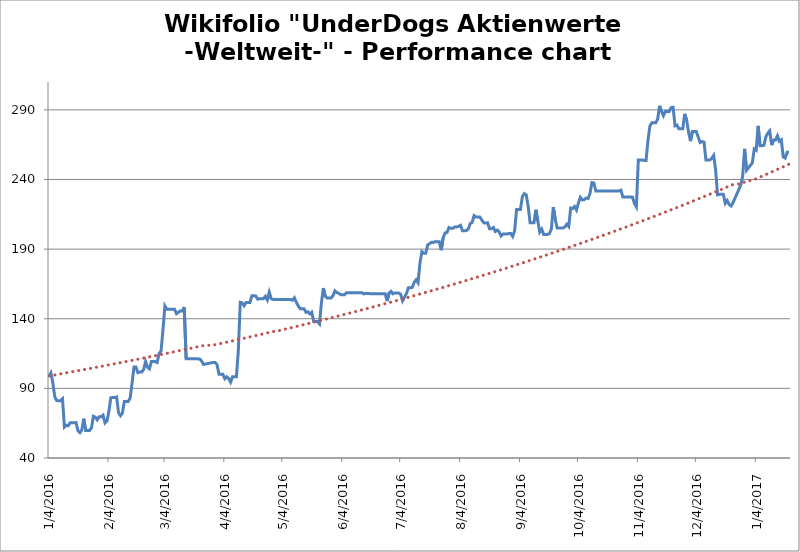
| Category | Close | Trend |
|---|---|---|
| 04/01/2016 | 98.898 | 98.898 |
| 05/01/2016 | 101.12 | 99.145 |
| 06/01/2016 | 93.999 | 99.393 |
| 07/01/2016 | 84.12 | 99.642 |
| 08/01/2016 | 81.237 | 99.891 |
| 09/01/2016 | 81.153 | 100.14 |
| 10/01/2016 | 81.151 | 100.391 |
| 11/01/2016 | 82.548 | 100.642 |
| 12/01/2016 | 62.218 | 100.893 |
| 13/01/2016 | 63.451 | 101.146 |
| 14/01/2016 | 63.203 | 101.398 |
| 15/01/2016 | 65.341 | 101.652 |
| 16/01/2016 | 65.339 | 101.906 |
| 17/01/2016 | 65.338 | 102.161 |
| 18/01/2016 | 65.418 | 102.416 |
| 19/01/2016 | 59.573 | 102.672 |
| 20/01/2016 | 58.172 | 102.929 |
| 21/01/2016 | 60.228 | 103.186 |
| 22/01/2016 | 68.21 | 103.444 |
| 23/01/2016 | 59.731 | 103.703 |
| 24/01/2016 | 59.73 | 103.962 |
| 25/01/2016 | 59.728 | 104.222 |
| 26/01/2016 | 61.701 | 104.483 |
| 27/01/2016 | 69.938 | 104.744 |
| 28/01/2016 | 69.278 | 105.006 |
| 29/01/2016 | 67.376 | 105.268 |
| 30/01/2016 | 69.596 | 105.531 |
| 31/01/2016 | 69.594 | 105.795 |
| 01/02/2016 | 70.744 | 106.06 |
| 02/02/2016 | 65.146 | 106.325 |
| 03/02/2016 | 66.544 | 106.591 |
| 04/02/2016 | 73.381 | 106.857 |
| 05/02/2016 | 83.247 | 107.124 |
| 06/02/2016 | 83.409 | 107.392 |
| 07/02/2016 | 83.407 | 107.661 |
| 08/02/2016 | 83.825 | 107.93 |
| 09/02/2016 | 72.539 | 108.199 |
| 10/02/2016 | 70.397 | 108.47 |
| 11/02/2016 | 72.206 | 108.741 |
| 12/02/2016 | 80.599 | 109.013 |
| 13/02/2016 | 80.597 | 109.286 |
| 14/02/2016 | 80.595 | 109.559 |
| 15/02/2016 | 83.064 | 109.833 |
| 16/02/2016 | 93.758 | 110.107 |
| 17/02/2016 | 105.361 | 110.383 |
| 18/02/2016 | 105.383 | 110.658 |
| 19/02/2016 | 101.257 | 110.935 |
| 20/02/2016 | 101.757 | 111.212 |
| 21/02/2016 | 101.754 | 111.49 |
| 22/02/2016 | 103.505 | 111.769 |
| 23/02/2016 | 109.18 | 112.049 |
| 24/02/2016 | 105.228 | 112.329 |
| 25/02/2016 | 104.032 | 112.61 |
| 26/02/2016 | 109.254 | 112.891 |
| 27/02/2016 | 109.252 | 113.173 |
| 28/02/2016 | 109.249 | 113.456 |
| 29/02/2016 | 108.58 | 113.74 |
| 01/03/2016 | 115.086 | 114.024 |
| 02/03/2016 | 116.729 | 114.309 |
| 03/03/2016 | 132.184 | 114.595 |
| 04/03/2016 | 149.232 | 114.882 |
| 05/03/2016 | 146.82 | 115.169 |
| 06/03/2016 | 146.816 | 115.457 |
| 07/03/2016 | 146.813 | 115.745 |
| 08/03/2016 | 146.809 | 116.035 |
| 09/03/2016 | 146.805 | 116.325 |
| 10/03/2016 | 143.618 | 116.616 |
| 11/03/2016 | 144.649 | 116.907 |
| 12/03/2016 | 145.615 | 117.199 |
| 13/03/2016 | 145.569 | 117.492 |
| 14/03/2016 | 148.306 | 117.786 |
| 15/03/2016 | 111.196 | 118.081 |
| 16/03/2016 | 111.193 | 118.376 |
| 17/03/2016 | 111.191 | 118.672 |
| 18/03/2016 | 111.188 | 118.968 |
| 19/03/2016 | 111.185 | 119.266 |
| 20/03/2016 | 111.182 | 119.564 |
| 21/03/2016 | 111.179 | 119.863 |
| 22/03/2016 | 111.176 | 120.163 |
| 23/03/2016 | 109.614 | 120.463 |
| 24/03/2016 | 107.199 | 120.764 |
| 29/03/2016 | 108.614 | 121.066 |
| 30/03/2016 | 108.611 | 121.369 |
| 31/03/2016 | 106.915 | 121.672 |
| 01/04/2016 | 100.081 | 121.976 |
| 02/04/2016 | 100.079 | 122.281 |
| 03/04/2016 | 100.076 | 122.587 |
| 04/04/2016 | 96.97 | 122.893 |
| 05/04/2016 | 98.289 | 123.201 |
| 06/04/2016 | 97.098 | 123.509 |
| 07/04/2016 | 94.423 | 123.817 |
| 08/04/2016 | 98.282 | 124.127 |
| 09/04/2016 | 98.279 | 124.437 |
| 10/04/2016 | 98.276 | 124.748 |
| 11/04/2016 | 117.133 | 125.06 |
| 12/04/2016 | 151.79 | 125.373 |
| 13/04/2016 | 151.403 | 125.686 |
| 14/04/2016 | 149.32 | 126.001 |
| 15/04/2016 | 151.733 | 126.316 |
| 16/04/2016 | 151.735 | 126.631 |
| 17/04/2016 | 151.596 | 126.948 |
| 18/04/2016 | 156.443 | 127.265 |
| 19/04/2016 | 156.6 | 127.583 |
| 20/04/2016 | 156.338 | 127.902 |
| 21/04/2016 | 154.053 | 128.222 |
| 22/04/2016 | 154.409 | 128.543 |
| 23/04/2016 | 154.405 | 128.864 |
| 24/04/2016 | 154.401 | 129.186 |
| 25/04/2016 | 156.077 | 129.509 |
| 26/04/2016 | 153.493 | 129.833 |
| 27/04/2016 | 159.069 | 130.158 |
| 28/04/2016 | 154.379 | 130.483 |
| 29/04/2016 | 153.895 | 130.809 |
| 30/04/2016 | 153.891 | 131.136 |
| 02/05/2016 | 153.883 | 131.464 |
| 03/05/2016 | 153.879 | 131.793 |
| 04/05/2016 | 153.875 | 132.122 |
| 05/05/2016 | 153.871 | 132.452 |
| 06/05/2016 | 153.867 | 132.784 |
| 07/05/2016 | 153.863 | 133.116 |
| 08/05/2016 | 153.859 | 133.448 |
| 09/05/2016 | 153.243 | 133.782 |
| 10/05/2016 | 155.031 | 134.116 |
| 11/05/2016 | 151.84 | 134.452 |
| 12/05/2016 | 149.236 | 134.788 |
| 13/05/2016 | 147.232 | 135.125 |
| 14/05/2016 | 147.229 | 135.463 |
| 15/05/2016 | 147.225 | 135.801 |
| 16/05/2016 | 144.621 | 136.141 |
| 17/05/2016 | 145.017 | 136.481 |
| 18/05/2016 | 143.494 | 136.822 |
| 19/05/2016 | 144.69 | 137.164 |
| 20/05/2016 | 137.955 | 137.507 |
| 21/05/2016 | 137.952 | 137.851 |
| 22/05/2016 | 137.948 | 138.196 |
| 23/05/2016 | 136.284 | 138.541 |
| 24/05/2016 | 151.428 | 138.888 |
| 25/05/2016 | 162.007 | 139.235 |
| 26/05/2016 | 156.102 | 139.583 |
| 27/05/2016 | 154.874 | 139.932 |
| 28/05/2016 | 154.87 | 140.282 |
| 29/05/2016 | 154.866 | 140.632 |
| 30/05/2016 | 156.625 | 140.984 |
| 31/05/2016 | 160.024 | 141.336 |
| 01/06/2016 | 158.773 | 141.69 |
| 02/06/2016 | 158.244 | 142.044 |
| 03/06/2016 | 157.24 | 142.399 |
| 04/06/2016 | 157.236 | 142.755 |
| 05/06/2016 | 157.231 | 143.112 |
| 06/06/2016 | 158.692 | 143.47 |
| 07/06/2016 | 158.688 | 143.828 |
| 08/06/2016 | 158.684 | 144.188 |
| 09/06/2016 | 158.68 | 144.548 |
| 10/06/2016 | 158.676 | 144.91 |
| 11/06/2016 | 158.672 | 145.272 |
| 12/06/2016 | 158.668 | 145.635 |
| 13/06/2016 | 158.663 | 145.999 |
| 14/06/2016 | 158.659 | 146.364 |
| 15/06/2016 | 157.811 | 146.73 |
| 16/06/2016 | 158.338 | 147.097 |
| 17/06/2016 | 158.038 | 147.465 |
| 18/06/2016 | 158.034 | 147.834 |
| 19/06/2016 | 158.03 | 148.203 |
| 20/06/2016 | 158.026 | 148.574 |
| 21/06/2016 | 158.021 | 148.945 |
| 22/06/2016 | 158.017 | 149.317 |
| 23/06/2016 | 158.013 | 149.691 |
| 24/06/2016 | 158.009 | 150.065 |
| 25/06/2016 | 158.005 | 150.44 |
| 26/06/2016 | 158.001 | 150.816 |
| 27/06/2016 | 152.716 | 151.193 |
| 28/06/2016 | 158.431 | 151.571 |
| 29/06/2016 | 159.679 | 151.95 |
| 30/06/2016 | 157.919 | 152.33 |
| 01/07/2016 | 158.493 | 152.711 |
| 02/07/2016 | 158.536 | 153.093 |
| 03/07/2016 | 158.531 | 153.475 |
| 04/07/2016 | 157.556 | 153.859 |
| 05/07/2016 | 152.828 | 154.244 |
| 06/07/2016 | 155.516 | 154.629 |
| 07/07/2016 | 158.098 | 155.016 |
| 08/07/2016 | 162.233 | 155.403 |
| 09/07/2016 | 162.243 | 155.792 |
| 10/07/2016 | 162.503 | 156.181 |
| 11/07/2016 | 166.131 | 156.572 |
| 12/07/2016 | 167.989 | 156.963 |
| 13/07/2016 | 165.906 | 157.356 |
| 14/07/2016 | 179.957 | 157.749 |
| 15/07/2016 | 188.229 | 158.143 |
| 16/07/2016 | 186.985 | 158.539 |
| 17/07/2016 | 186.977 | 158.935 |
| 18/07/2016 | 192.982 | 159.332 |
| 19/07/2016 | 193.945 | 159.731 |
| 20/07/2016 | 194.959 | 160.13 |
| 21/07/2016 | 194.791 | 160.53 |
| 22/07/2016 | 195.377 | 160.932 |
| 23/07/2016 | 195.356 | 161.334 |
| 24/07/2016 | 195.351 | 161.737 |
| 25/07/2016 | 189.195 | 162.142 |
| 26/07/2016 | 198.283 | 162.547 |
| 27/07/2016 | 201.543 | 162.954 |
| 28/07/2016 | 201.99 | 163.361 |
| 29/07/2016 | 205.496 | 163.769 |
| 30/07/2016 | 204.953 | 164.179 |
| 31/07/2016 | 204.947 | 164.589 |
| 01/08/2016 | 205.903 | 165.001 |
| 02/08/2016 | 205.945 | 165.413 |
| 03/08/2016 | 206.257 | 165.827 |
| 04/08/2016 | 207.079 | 166.241 |
| 05/08/2016 | 203.123 | 166.657 |
| 06/08/2016 | 203.155 | 167.074 |
| 07/08/2016 | 203.35 | 167.491 |
| 08/08/2016 | 204.365 | 167.91 |
| 09/08/2016 | 208.353 | 168.33 |
| 10/08/2016 | 209.128 | 168.751 |
| 11/08/2016 | 214.047 | 169.172 |
| 12/08/2016 | 213.003 | 169.595 |
| 13/08/2016 | 213.003 | 170.019 |
| 14/08/2016 | 212.998 | 170.444 |
| 15/08/2016 | 210.897 | 170.87 |
| 16/08/2016 | 208.899 | 171.298 |
| 17/08/2016 | 208.731 | 171.726 |
| 18/08/2016 | 208.915 | 172.155 |
| 19/08/2016 | 204.636 | 172.586 |
| 20/08/2016 | 204.636 | 173.017 |
| 21/08/2016 | 205.552 | 173.45 |
| 22/08/2016 | 202.671 | 173.883 |
| 23/08/2016 | 203.651 | 174.318 |
| 24/08/2016 | 202.365 | 174.754 |
| 25/08/2016 | 199.56 | 175.191 |
| 26/08/2016 | 200.912 | 175.629 |
| 27/08/2016 | 200.907 | 176.068 |
| 28/08/2016 | 200.851 | 176.508 |
| 29/08/2016 | 201.238 | 176.949 |
| 30/08/2016 | 201.232 | 177.391 |
| 31/08/2016 | 199.05 | 177.835 |
| 01/09/2016 | 203.323 | 178.28 |
| 02/09/2016 | 218.455 | 178.725 |
| 03/09/2016 | 218.455 | 179.172 |
| 04/09/2016 | 218.449 | 179.62 |
| 05/09/2016 | 227.714 | 180.069 |
| 06/09/2016 | 229.847 | 180.519 |
| 07/09/2016 | 228.924 | 180.97 |
| 08/09/2016 | 220.651 | 181.423 |
| 09/09/2016 | 208.925 | 181.876 |
| 10/09/2016 | 208.92 | 182.331 |
| 11/09/2016 | 208.915 | 182.787 |
| 12/09/2016 | 218.264 | 183.244 |
| 13/09/2016 | 210.044 | 183.702 |
| 14/09/2016 | 202.247 | 184.161 |
| 15/09/2016 | 204.384 | 184.622 |
| 16/09/2016 | 200.508 | 185.083 |
| 17/09/2016 | 200.502 | 185.546 |
| 18/09/2016 | 200.497 | 186.01 |
| 19/09/2016 | 201.124 | 186.475 |
| 20/09/2016 | 204.516 | 186.941 |
| 21/09/2016 | 220.085 | 187.408 |
| 22/09/2016 | 211.537 | 187.877 |
| 23/09/2016 | 205.106 | 188.347 |
| 24/09/2016 | 205.106 | 188.818 |
| 25/09/2016 | 205.101 | 189.29 |
| 26/09/2016 | 205.09 | 189.763 |
| 27/09/2016 | 205.904 | 190.237 |
| 28/09/2016 | 207.927 | 190.713 |
| 29/09/2016 | 206.258 | 191.19 |
| 30/09/2016 | 219.508 | 191.668 |
| 01/10/2016 | 219.133 | 192.147 |
| 02/10/2016 | 220.627 | 192.627 |
| 03/10/2016 | 218.084 | 193.109 |
| 04/10/2016 | 223.034 | 193.591 |
| 05/10/2016 | 227.166 | 194.075 |
| 06/10/2016 | 225.398 | 194.561 |
| 07/10/2016 | 225.517 | 195.047 |
| 08/10/2016 | 226.689 | 195.535 |
| 09/10/2016 | 226.297 | 196.023 |
| 10/10/2016 | 229.993 | 196.513 |
| 11/10/2016 | 237.776 | 197.005 |
| 12/10/2016 | 237.494 | 197.497 |
| 13/10/2016 | 231.793 | 197.991 |
| 14/10/2016 | 231.787 | 198.486 |
| 15/10/2016 | 231.787 | 198.982 |
| 16/10/2016 | 231.781 | 199.48 |
| 17/10/2016 | 231.769 | 199.978 |
| 18/10/2016 | 231.769 | 200.478 |
| 19/10/2016 | 231.757 | 200.98 |
| 20/10/2016 | 231.757 | 201.482 |
| 21/10/2016 | 231.751 | 201.986 |
| 22/10/2016 | 231.745 | 202.491 |
| 23/10/2016 | 231.739 | 202.997 |
| 24/10/2016 | 231.733 | 203.504 |
| 25/10/2016 | 231.721 | 204.013 |
| 26/10/2016 | 232.33 | 204.523 |
| 27/10/2016 | 227.359 | 205.034 |
| 28/10/2016 | 227.359 | 205.547 |
| 29/10/2016 | 227.353 | 206.061 |
| 30/10/2016 | 227.347 | 206.576 |
| 31/10/2016 | 227.335 | 207.093 |
| 01/11/2016 | 227.33 | 207.61 |
| 02/11/2016 | 222.708 | 208.129 |
| 03/11/2016 | 220.321 | 208.65 |
| 04/11/2016 | 254.057 | 209.171 |
| 05/11/2016 | 254.057 | 209.694 |
| 06/11/2016 | 254.051 | 210.218 |
| 07/11/2016 | 253.647 | 210.744 |
| 08/11/2016 | 253.647 | 211.271 |
| 09/11/2016 | 268.12 | 211.799 |
| 10/11/2016 | 278.47 | 212.328 |
| 11/11/2016 | 280.67 | 212.859 |
| 12/11/2016 | 280.742 | 213.391 |
| 13/11/2016 | 280.725 | 213.925 |
| 14/11/2016 | 283.337 | 214.46 |
| 15/11/2016 | 292.893 | 214.996 |
| 16/11/2016 | 289.012 | 215.533 |
| 17/11/2016 | 285.826 | 216.072 |
| 18/11/2016 | 288.839 | 216.612 |
| 19/11/2016 | 288.831 | 217.154 |
| 20/11/2016 | 288.824 | 217.697 |
| 21/11/2016 | 291.581 | 218.241 |
| 22/11/2016 | 291.82 | 218.787 |
| 23/11/2016 | 278.483 | 219.334 |
| 24/11/2016 | 279.037 | 219.882 |
| 25/11/2016 | 276.352 | 220.432 |
| 26/11/2016 | 276.352 | 220.983 |
| 27/11/2016 | 276.345 | 221.535 |
| 28/11/2016 | 287.112 | 222.089 |
| 29/11/2016 | 282.635 | 222.644 |
| 30/11/2016 | 274.017 | 223.201 |
| 01/12/2016 | 267.543 | 223.759 |
| 02/12/2016 | 274.511 | 224.318 |
| 03/12/2016 | 274.502 | 224.879 |
| 04/12/2016 | 274.449 | 225.441 |
| 05/12/2016 | 270.517 | 226.005 |
| 06/12/2016 | 266.533 | 226.57 |
| 07/12/2016 | 267.226 | 227.136 |
| 08/12/2016 | 266.852 | 227.704 |
| 09/12/2016 | 253.954 | 228.273 |
| 10/12/2016 | 253.954 | 228.844 |
| 11/12/2016 | 253.948 | 229.416 |
| 12/12/2016 | 255.286 | 229.99 |
| 13/12/2016 | 257.305 | 230.565 |
| 14/12/2016 | 246.864 | 231.141 |
| 15/12/2016 | 229.014 | 231.719 |
| 16/12/2016 | 229.318 | 232.298 |
| 17/12/2016 | 229.306 | 232.879 |
| 18/12/2016 | 229.306 | 233.461 |
| 19/12/2016 | 222.906 | 234.045 |
| 20/12/2016 | 224.881 | 234.63 |
| 21/12/2016 | 222.072 | 235.217 |
| 22/12/2016 | 220.931 | 235.805 |
| 23/12/2016 | 223.289 | 236.394 |
| 27/12/2016 | 235.907 | 236.985 |
| 28/12/2016 | 242.443 | 237.578 |
| 29/12/2016 | 261.983 | 238.171 |
| 30/12/2016 | 246.558 | 238.767 |
| 02/01/2017 | 251.917 | 239.364 |
| 03/01/2017 | 261.974 | 239.962 |
| 04/01/2017 | 261 | 240.562 |
| 05/01/2017 | 278.504 | 241.164 |
| 06/01/2017 | 264.259 | 241.766 |
| 07/01/2017 | 264.259 | 242.371 |
| 08/01/2017 | 264.608 | 242.977 |
| 09/01/2017 | 270.659 | 243.584 |
| 10/01/2017 | 273.226 | 244.193 |
| 11/01/2017 | 274.921 | 244.804 |
| 12/01/2017 | 264.722 | 245.416 |
| 13/01/2017 | 268.346 | 246.029 |
| 14/01/2017 | 268.329 | 246.644 |
| 15/01/2017 | 271.363 | 247.261 |
| 16/01/2017 | 267.43 | 247.879 |
| 17/01/2017 | 268.496 | 248.499 |
| 18/01/2017 | 256.185 | 249.12 |
| 19/01/2017 | 255.354 | 249.743 |
| 20/01/2017 | 259.553 | 250.367 |
| 21/01/2017 | 259.557 | 250.993 |